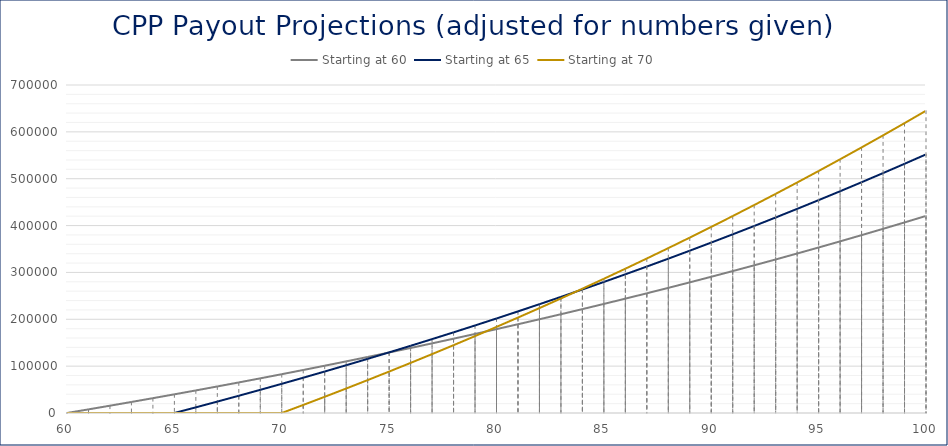
| Category | Starting at 60 | Starting at 65 | Starting at 70 |
|---|---|---|---|
| 60.0 | 0 | 0 | 0 |
| nan | 7733.021 | 0 | 0 |
| nan | 15582.837 | 0 | 0 |
| nan | 23551.214 | 0 | 0 |
| nan | 31639.942 | 0 | 0 |
| 65.0 | 39850.838 | 0 | 0 |
| nan | 48185.748 | 12082.845 | 0 |
| nan | 56646.545 | 24348.183 | 0 |
| nan | 65235.13 | 36798.772 | 0 |
| nan | 73953.433 | 49437.409 | 0 |
| 70.0 | 82803.413 | 62266.935 | 0 |
| nan | 91787.06 | 75290.231 | 17157.64 |
| nan | 100906.391 | 88510.226 | 34574.42 |
| nan | 110163.457 | 101929.89 | 52254.257 |
| nan | 119560.338 | 115552.239 | 70201.121 |
| 75.0 | 129099.145 | 129380.333 | 88419.047 |
| nan | 138782.022 | 143417.281 | 106912.129 |
| nan | 148611.144 | 157666.237 | 125684.522 |
| nan | 158588.722 | 172130.402 | 144740.444 |
| nan | 168716.996 | 186813.028 | 164084.179 |
| 80.0 | 178998.243 | 201717.414 | 183720.073 |
| nan | 189434.774 | 216846.909 | 203652.539 |
| nan | 200028.933 | 232204.913 | 223886.056 |
| nan | 210783.102 | 247794.878 | 244425.171 |
| nan | 221699.697 | 263620.306 | 265274.5 |
| 85.0 | 232781.171 | 279684.755 | 286438.728 |
| nan | 244030.015 | 295991.834 | 307922.61 |
| nan | 255448.757 | 312545.208 | 329730.976 |
| nan | 267039.962 | 329348.596 | 351868.726 |
| nan | 278806.236 | 346405.776 | 374340.835 |
| 90.0 | 290750.222 | 363720.58 | 397152.352 |
| nan | 302874.605 | 381296.899 | 420308.404 |
| nan | 315182.109 | 399138.682 | 443814.195 |
| nan | 327675.5 | 417249.941 | 467675.007 |
| nan | 340357.586 | 435634.743 | 491896.202 |
| 95.0 | 353231.216 | 454297.221 | 516483.223 |
| nan | 366299.284 | 473241.57 | 541441.596 |
| nan | 379564.727 | 492472.045 | 566776.929 |
| nan | 393030.524 | 511992.969 | 592494.916 |
| nan | 406699.703 | 531808.728 | 618601.335 |
| 100.0 | 420575.336 | 551923.775 | 645102.054 |